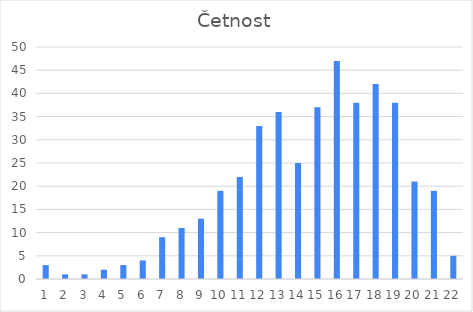
| Category | Series 0 |
|---|---|
| 0 | 3 |
| 1 | 1 |
| 2 | 1 |
| 3 | 2 |
| 4 | 3 |
| 5 | 4 |
| 6 | 9 |
| 7 | 11 |
| 8 | 13 |
| 9 | 19 |
| 10 | 22 |
| 11 | 33 |
| 12 | 36 |
| 13 | 25 |
| 14 | 37 |
| 15 | 47 |
| 16 | 38 |
| 17 | 42 |
| 18 | 38 |
| 19 | 21 |
| 20 | 19 |
| 21 | 5 |